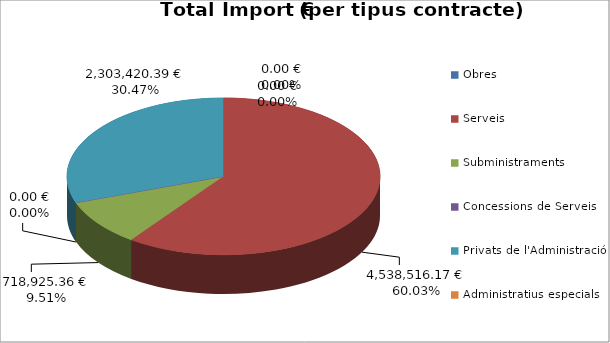
| Category | Total preu              (amb iva) |
|---|---|
| Obres | 0 |
| Serveis | 4538516.17 |
| Subministraments | 718925.36 |
| Concessions de Serveis | 0 |
| Privats de l'Administració | 2303420.39 |
| Administratius especials | 0 |